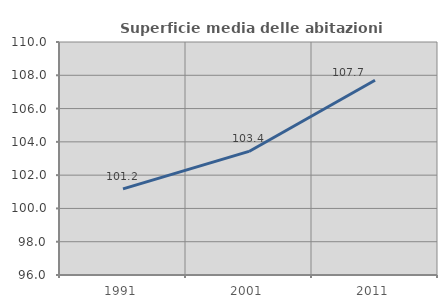
| Category | Superficie media delle abitazioni occupate |
|---|---|
| 1991.0 | 101.176 |
| 2001.0 | 103.424 |
| 2011.0 | 107.702 |